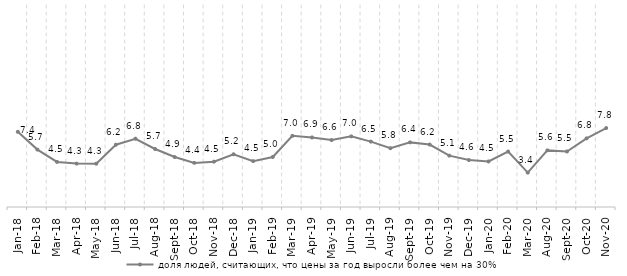
| Category | доля людей, считающих, что цены за год выросли более чем на 30% |
|---|---|
| 2018-01-01 | 7.445 |
| 2018-02-01 | 5.682 |
| 2018-03-01 | 4.463 |
| 2018-04-01 | 4.296 |
| 2018-05-01 | 4.287 |
| 2018-06-01 | 6.164 |
| 2018-07-01 | 6.758 |
| 2018-08-01 | 5.744 |
| 2018-09-01 | 4.946 |
| 2018-10-01 | 4.368 |
| 2018-11-01 | 4.491 |
| 2018-12-01 | 5.219 |
| 2019-01-01 | 4.543 |
| 2019-02-01 | 4.953 |
| 2019-03-01 | 7.044 |
| 2019-04-01 | 6.883 |
| 2019-05-01 | 6.627 |
| 2019-06-01 | 6.991 |
| 2019-07-01 | 6.476 |
| 2019-08-01 | 5.822 |
| 2019-09-01 | 6.397 |
| 2019-10-01 | 6.183 |
| 2019-11-01 | 5.085 |
| 2019-12-01 | 4.649 |
| 2020-01-01 | 4.51 |
| 2020-02-01 | 5.488 |
| 2020-03-01 | 3.403 |
| 2020-08-01 | 5.606 |
| 2020-09-01 | 5.496 |
| 2020-10-01 | 6.796 |
| 2020-11-01 | 7.818 |